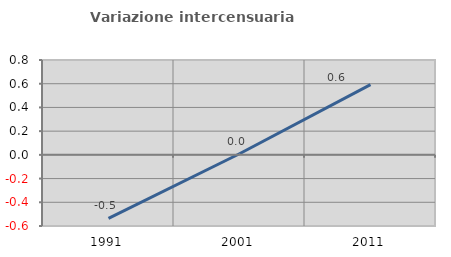
| Category | Variazione intercensuaria annua |
|---|---|
| 1991.0 | -0.536 |
| 2001.0 | 0.009 |
| 2011.0 | 0.592 |